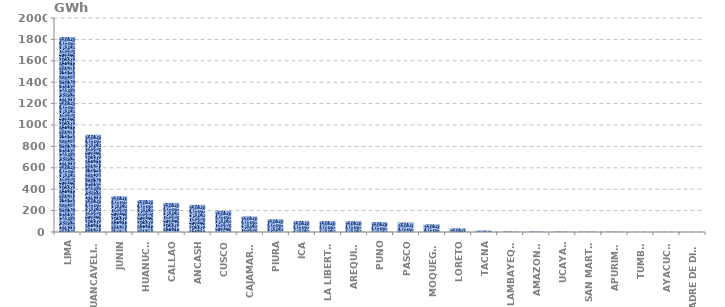
| Category | Series 0 |
|---|---|
| LIMA | 1822.493 |
| HUANCAVELICA | 909.409 |
| JUNIN | 333.605 |
| HUANUCO | 298.749 |
| CALLAO | 272.362 |
| ANCASH | 253.682 |
| CUSCO | 198.884 |
| CAJAMARCA | 145.388 |
| PIURA | 118.861 |
| ICA | 103.598 |
| LA LIBERTAD | 102.069 |
| AREQUIPA | 100.906 |
| PUNO | 92.707 |
| PASCO | 88.338 |
| MOQUEGUA | 71.631 |
| LORETO | 34.898 |
| TACNA | 14.203 |
| LAMBAYEQUE | 5.091 |
| AMAZONAS | 4.676 |
| UCAYALI | 3.682 |
| SAN MARTÍN | 3.129 |
| APURIMAC | 3.052 |
| TUMBES | 1.101 |
| AYACUCHO | 0.899 |
| MADRE DE DIOS | 0.153 |